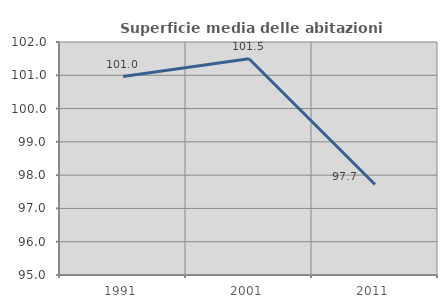
| Category | Superficie media delle abitazioni occupate |
|---|---|
| 1991.0 | 100.962 |
| 2001.0 | 101.496 |
| 2011.0 | 97.717 |